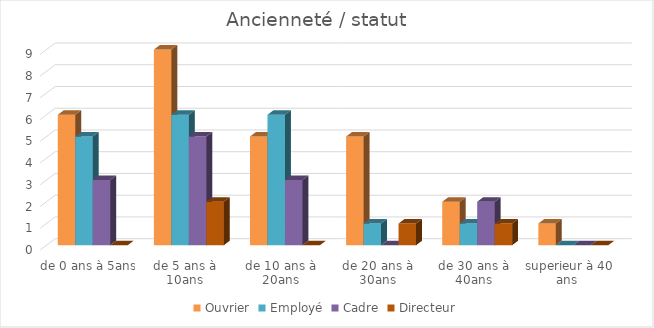
| Category | Ouvrier | Employé | Cadre | Directeur |
|---|---|---|---|---|
| de 0 ans à 5ans | 6 | 5 | 3 | 0 |
| de 5 ans à 10ans | 9 | 6 | 5 | 2 |
| de 10 ans à 20ans | 5 | 6 | 3 | 0 |
| de 20 ans à 30ans | 5 | 1 | 0 | 1 |
| de 30 ans à 40ans | 2 | 1 | 2 | 1 |
| superieur à 40 ans  | 1 | 0 | 0 | 0 |